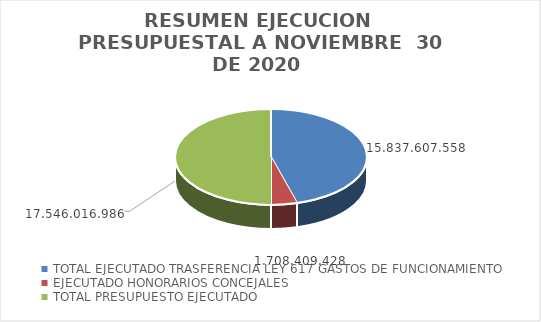
| Category | Series 0 |
|---|---|
| TOTAL EJECUTADO TRASFERENCIA LEY 617 GASTOS DE FUNCIONAMIENTO  | 12782052296 |
| EJECUTADO HONORARIOS CONCEJALES  | 1218668836 |
| TOTAL PRESUPUESTO EJECUTADO  | 14000721132 |